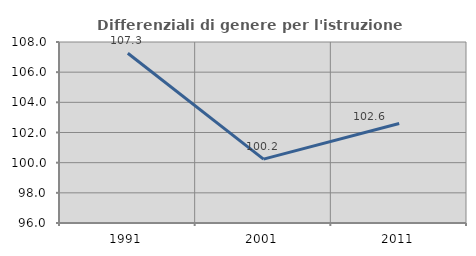
| Category | Differenziali di genere per l'istruzione superiore |
|---|---|
| 1991.0 | 107.257 |
| 2001.0 | 100.236 |
| 2011.0 | 102.598 |